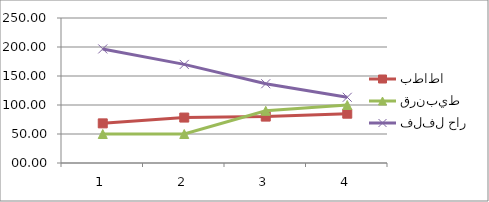
| Category | بطاطا | قرنبيط | فلفل حار |
|---|---|---|---|
| 0 | 68.33 | 50 | 196.67 |
| 1 | 78.33 | 50 | 170 |
| 2 | 80 | 90 | 136.67 |
| 3 | 85 | 100 | 113.33 |